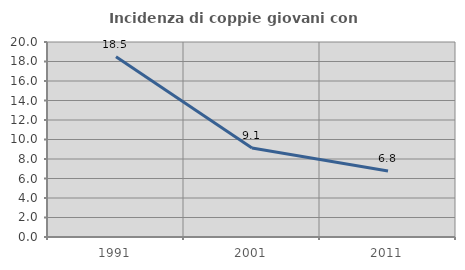
| Category | Incidenza di coppie giovani con figli |
|---|---|
| 1991.0 | 18.482 |
| 2001.0 | 9.119 |
| 2011.0 | 6.762 |